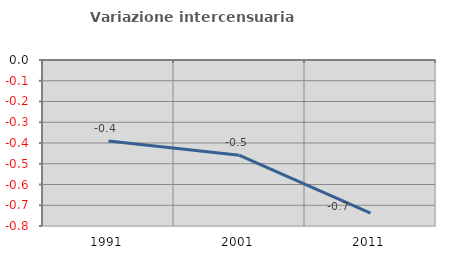
| Category | Variazione intercensuaria annua |
|---|---|
| 1991.0 | -0.39 |
| 2001.0 | -0.459 |
| 2011.0 | -0.738 |